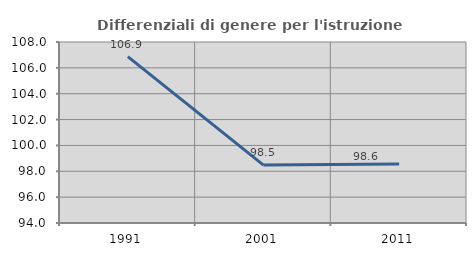
| Category | Differenziali di genere per l'istruzione superiore |
|---|---|
| 1991.0 | 106.865 |
| 2001.0 | 98.478 |
| 2011.0 | 98.568 |